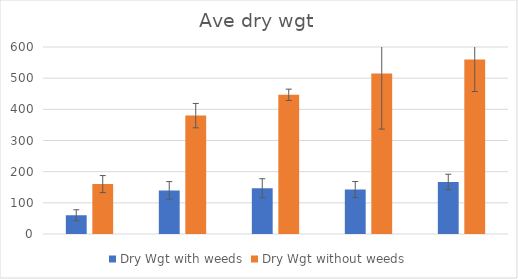
| Category | Dry Wgt with weeds | Dry Wgt without weeds |
|---|---|---|
| 0 | 60.167 | 160.167 |
| 1 | 139.833 | 379.833 |
| 2 | 146.833 | 446.667 |
| 3 | 142.667 | 515 |
| 4 | 166.833 | 560 |